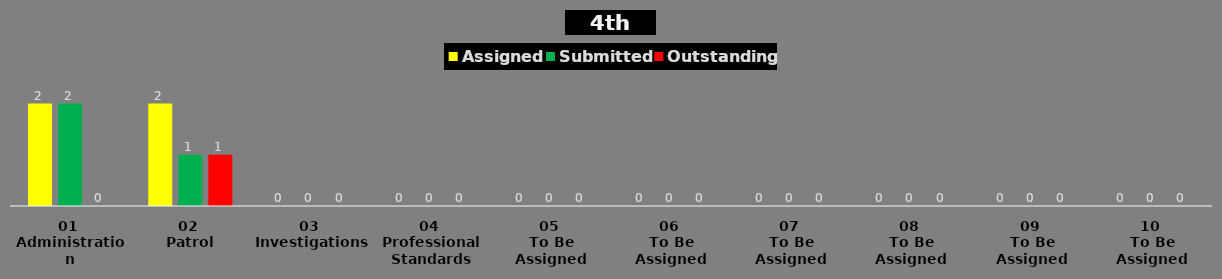
| Category | Assigned | Submitted | Outstanding |
|---|---|---|---|
| 01 
Administration | 2 | 2 | 0 |
| 02 
Patrol | 2 | 1 | 1 |
| 03 
Investigations | 0 | 0 | 0 |
| 04 
Professional Standards | 0 | 0 | 0 |
| 05 
To Be Assigned | 0 | 0 | 0 |
| 06 
To Be Assigned | 0 | 0 | 0 |
| 07 
To Be Assigned | 0 | 0 | 0 |
| 08 
To Be Assigned | 0 | 0 | 0 |
| 09 
To Be Assigned | 0 | 0 | 0 |
| 10 
To Be Assigned | 0 | 0 | 0 |